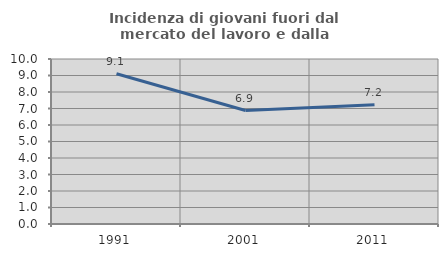
| Category | Incidenza di giovani fuori dal mercato del lavoro e dalla formazione  |
|---|---|
| 1991.0 | 9.106 |
| 2001.0 | 6.875 |
| 2011.0 | 7.222 |